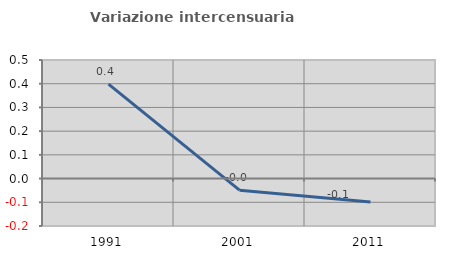
| Category | Variazione intercensuaria annua |
|---|---|
| 1991.0 | 0.398 |
| 2001.0 | -0.049 |
| 2011.0 | -0.098 |